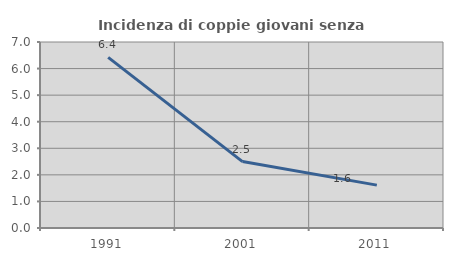
| Category | Incidenza di coppie giovani senza figli |
|---|---|
| 1991.0 | 6.422 |
| 2001.0 | 2.5 |
| 2011.0 | 1.613 |